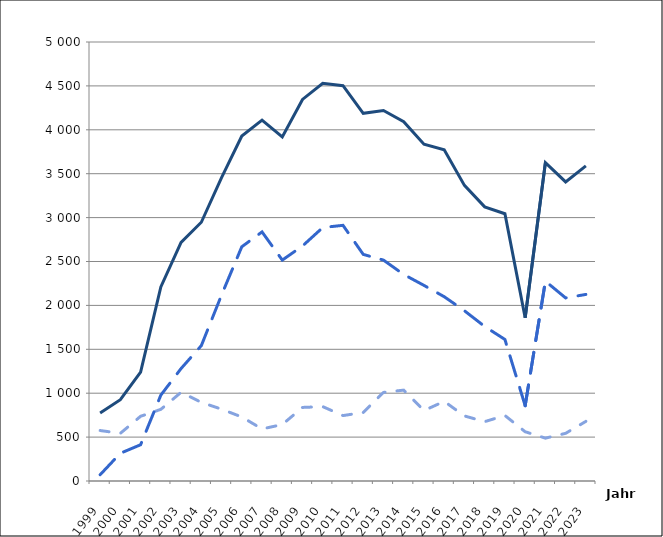
| Category | Series 0 | Series 1 | Series 2 |
|---|---|---|---|
| 1999.0 | 775 | 575 | 71 |
| 2000.0 | 926 | 543 | 316 |
| 2001.0 | 1241 | 737 | 413 |
| 2002.0 | 2211 | 816 | 978 |
| 2003.0 | 2717 | 1010 | 1281 |
| 2004.0 | 2947 | 896 | 1542 |
| 2005.0 | 3455 | 818 | 2119 |
| 2006.0 | 3929 | 729 | 2668 |
| 2007.0 | 4110 | 593 | 2837 |
| 2008.0 | 3919 | 643 | 2516 |
| 2009.0 | 4346 | 838 | 2677 |
| 2010.0 | 4530 | 847 | 2887 |
| 2011.0 | 4503 | 745 | 2912 |
| 2012.0 | 4188 | 781 | 2581 |
| 2013.0 | 4220 | 1009 | 2516 |
| 2014.0 | 4091 | 1035 | 2352 |
| 2015.0 | 3835 | 802 | 2228 |
| 2016.0 | 3772 | 907 | 2099 |
| 2017.0 | 3367 | 741 | 1939 |
| 2018.0 | 3122 | 676 | 1760 |
| 2019.0 | 3044 | 746 | 1612 |
| 2020.0 | 1859 | 561 | 858 |
| 2021.0 | 3626 | 488 | 2276 |
| 2022.0 | 3406 | 543 | 2085 |
| 2023.0 | 3589 | 679 | 2125 |